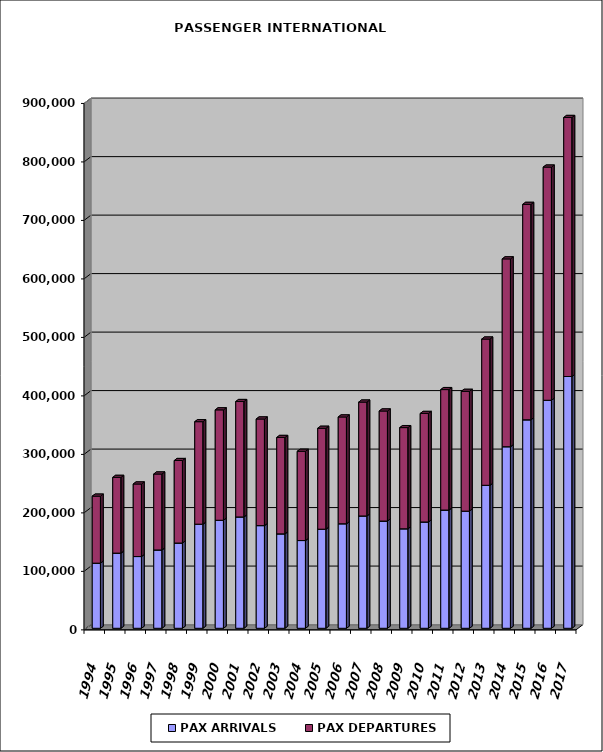
| Category | PAX ARRIVALS | PAX DEPARTURES |
|---|---|---|
| 1994.0 | 111329 | 114567 |
| 1995.0 | 128498 | 129480 |
| 1996.0 | 122653 | 124027 |
| 1997.0 | 133883 | 129852 |
| 1998.0 | 145740 | 141069 |
| 1999.0 | 177997 | 175196 |
| 2000.0 | 184681 | 188747 |
| 2001.0 | 190361 | 197298 |
| 2002.0 | 175531 | 182266 |
| 2003.0 | 161390 | 164842 |
| 2004.0 | 149988 | 152576 |
| 2005.0 | 169419 | 172494 |
| 2006.0 | 178691 | 182571 |
| 2007.0 | 192042 | 194682 |
| 2008.0 | 183339 | 188145 |
| 2009.0 | 170090 | 172978 |
| 2010.0 | 181746 | 185537 |
| 2011.0 | 202139 | 205935 |
| 2012.0 | 200271 | 204800 |
| 2013.0 | 244449 | 250017 |
| 2014.0 | 310416 | 321118 |
| 2015.0 | 356443 | 368254 |
| 2016.0 | 389817 | 398647 |
| 2017.0 | 430434 | 442837 |